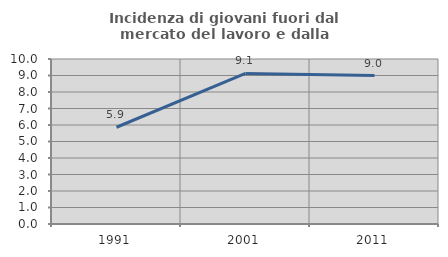
| Category | Incidenza di giovani fuori dal mercato del lavoro e dalla formazione  |
|---|---|
| 1991.0 | 5.863 |
| 2001.0 | 9.123 |
| 2011.0 | 9 |